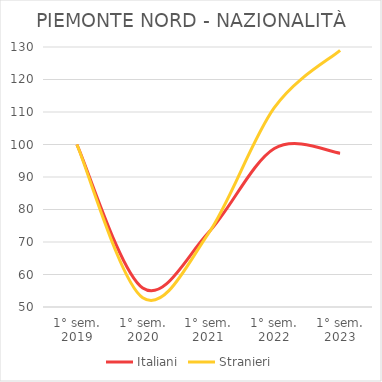
| Category | Italiani | Stranieri |
|---|---|---|
| 1° sem.
2019 | 100 | 100 |
| 1° sem.
2020 | 55.827 | 52.855 |
| 1° sem.
2021 | 72.909 | 72.666 |
| 1° sem.
2022 | 98.757 | 111.343 |
| 1° sem.
2023 | 97.34 | 128.988 |